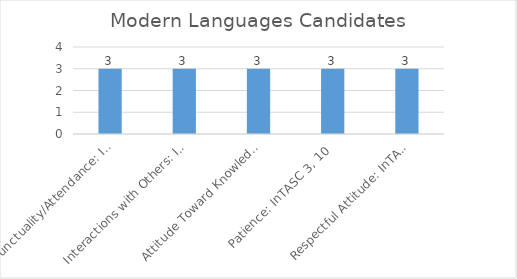
| Category | Series 0 |
|---|---|
| Punctuality/Attendance: InTASC 1, 9 | 3 |
| Interactions with Others: InTASC 3, 7, 10 | 3 |
| Attitude Toward Knowledge and Learning: InTASC 1, 4, 5, 9, 10 | 3 |
| Patience: InTASC 3, 10 | 3 |
| Respectful Attitude: InTASC 3, 7, 10 | 3 |